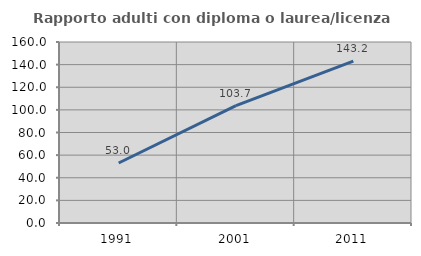
| Category | Rapporto adulti con diploma o laurea/licenza media  |
|---|---|
| 1991.0 | 53.018 |
| 2001.0 | 103.704 |
| 2011.0 | 143.169 |